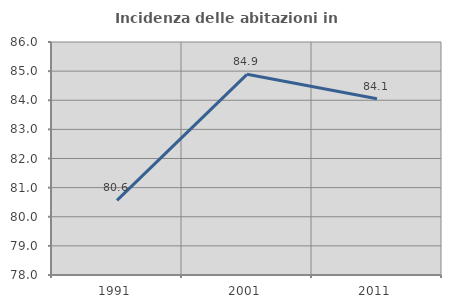
| Category | Incidenza delle abitazioni in proprietà  |
|---|---|
| 1991.0 | 80.561 |
| 2001.0 | 84.89 |
| 2011.0 | 84.051 |